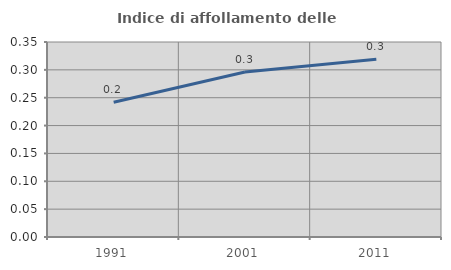
| Category | Indice di affollamento delle abitazioni  |
|---|---|
| 1991.0 | 0.242 |
| 2001.0 | 0.296 |
| 2011.0 | 0.319 |